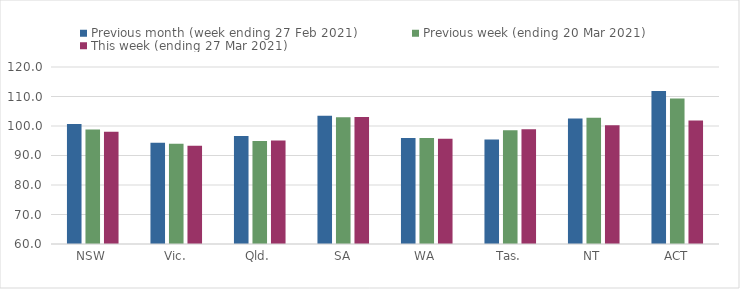
| Category | Previous month (week ending 27 Feb 2021) | Previous week (ending 20 Mar 2021) | This week (ending 27 Mar 2021) |
|---|---|---|---|
| NSW | 100.66 | 98.83 | 98.06 |
| Vic. | 94.34 | 94 | 93.3 |
| Qld. | 96.57 | 94.92 | 95.12 |
| SA | 103.48 | 103 | 103.01 |
| WA | 95.96 | 95.92 | 95.7 |
| Tas. | 95.41 | 98.6 | 98.88 |
| NT | 102.56 | 102.82 | 100.22 |
| ACT | 111.86 | 109.32 | 101.86 |